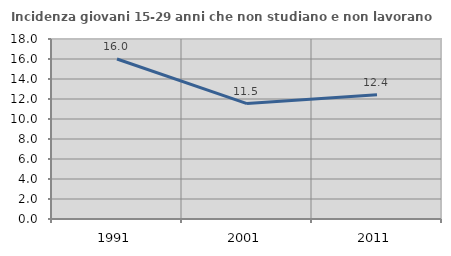
| Category | Incidenza giovani 15-29 anni che non studiano e non lavorano  |
|---|---|
| 1991.0 | 15.996 |
| 2001.0 | 11.545 |
| 2011.0 | 12.437 |